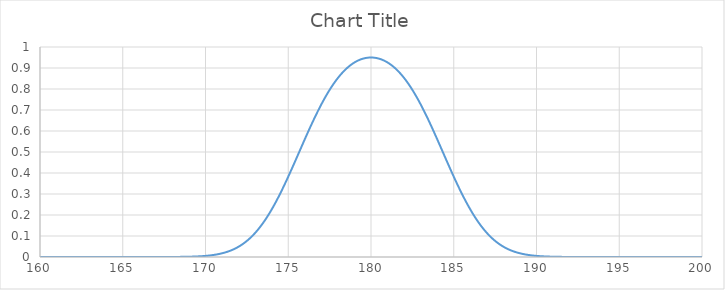
| Category | Series 0 |
|---|---|
| 160.0 | 0 |
| 160.1 | 0 |
| 160.2 | 0 |
| 160.3 | 0 |
| 160.4 | 0 |
| 160.5 | 0 |
| 160.6 | 0 |
| 160.7 | 0 |
| 160.8 | 0 |
| 160.9 | 0 |
| 161.0 | 0 |
| 161.1 | 0 |
| 161.2 | 0 |
| 161.3 | 0 |
| 161.4 | 0 |
| 161.5 | 0 |
| 161.6 | 0 |
| 161.7 | 0 |
| 161.8 | 0 |
| 161.9 | 0 |
| 162.0 | 0 |
| 162.1 | 0 |
| 162.2 | 0 |
| 162.3 | 0 |
| 162.4 | 0 |
| 162.5 | 0 |
| 162.6 | 0 |
| 162.7 | 0 |
| 162.8 | 0 |
| 162.9 | 0 |
| 163.0 | 0 |
| 163.1 | 0 |
| 163.2 | 0 |
| 163.3 | 0 |
| 163.4 | 0 |
| 163.5 | 0 |
| 163.6 | 0 |
| 163.7 | 0 |
| 163.8 | 0 |
| 163.9 | 0 |
| 164.0 | 0 |
| 164.1 | 0 |
| 164.2 | 0 |
| 164.3 | 0 |
| 164.4 | 0 |
| 164.5 | 0 |
| 164.6 | 0 |
| 164.7 | 0 |
| 164.8 | 0 |
| 164.9 | 0 |
| 165.0 | 0 |
| 165.1 | 0 |
| 165.2 | 0 |
| 165.3 | 0 |
| 165.4 | 0 |
| 165.5 | 0 |
| 165.6 | 0 |
| 165.7 | 0 |
| 165.8 | 0 |
| 165.9 | 0 |
| 166.0 | 0 |
| 166.1 | 0 |
| 166.2 | 0 |
| 166.3 | 0 |
| 166.4 | 0 |
| 166.5 | 0 |
| 166.6 | 0 |
| 166.7 | 0 |
| 166.8 | 0 |
| 166.9 | 0 |
| 167.0 | 0 |
| 167.1 | 0 |
| 167.2 | 0 |
| 167.3 | 0 |
| 167.4 | 0 |
| 167.5 | 0 |
| 167.6 | 0 |
| 167.7 | 0 |
| 167.8 | 0 |
| 167.9 | 0 |
| 168.0 | 0 |
| 168.1 | 0 |
| 168.2 | 0 |
| 168.3 | 0 |
| 168.4 | 0.001 |
| 168.5 | 0.001 |
| 168.6 | 0.001 |
| 168.7 | 0.001 |
| 168.799999999999 | 0.001 |
| 168.899999999999 | 0.001 |
| 168.999999999999 | 0.001 |
| 169.099999999999 | 0.002 |
| 169.199999999999 | 0.002 |
| 169.299999999999 | 0.002 |
| 169.399999999999 | 0.002 |
| 169.499999999999 | 0.003 |
| 169.599999999999 | 0.003 |
| 169.699999999999 | 0.004 |
| 169.799999999999 | 0.004 |
| 169.899999999999 | 0.005 |
| 169.999999999999 | 0.005 |
| 170.099999999999 | 0.006 |
| 170.199999999999 | 0.007 |
| 170.299999999999 | 0.008 |
| 170.399999999999 | 0.009 |
| 170.499999999999 | 0.01 |
| 170.599999999999 | 0.011 |
| 170.699999999999 | 0.013 |
| 170.799999999999 | 0.014 |
| 170.899999999999 | 0.016 |
| 170.999999999999 | 0.018 |
| 171.099999999999 | 0.02 |
| 171.199999999999 | 0.022 |
| 171.299999999999 | 0.024 |
| 171.399999999999 | 0.027 |
| 171.499999999999 | 0.03 |
| 171.599999999999 | 0.033 |
| 171.699999999999 | 0.037 |
| 171.799999999999 | 0.041 |
| 171.899999999999 | 0.045 |
| 171.999999999999 | 0.049 |
| 172.099999999999 | 0.054 |
| 172.199999999999 | 0.059 |
| 172.299999999999 | 0.064 |
| 172.399999999999 | 0.07 |
| 172.499999999999 | 0.077 |
| 172.599999999999 | 0.083 |
| 172.699999999999 | 0.09 |
| 172.799999999999 | 0.098 |
| 172.899999999999 | 0.106 |
| 172.999999999999 | 0.115 |
| 173.099999999999 | 0.124 |
| 173.199999999999 | 0.133 |
| 173.299999999999 | 0.143 |
| 173.399999999999 | 0.153 |
| 173.499999999999 | 0.164 |
| 173.599999999999 | 0.176 |
| 173.699999999999 | 0.188 |
| 173.799999999999 | 0.2 |
| 173.899999999999 | 0.213 |
| 173.999999999999 | 0.226 |
| 174.099999999999 | 0.24 |
| 174.199999999999 | 0.255 |
| 174.299999999999 | 0.269 |
| 174.399999999999 | 0.284 |
| 174.499999999999 | 0.3 |
| 174.599999999999 | 0.316 |
| 174.699999999999 | 0.332 |
| 174.799999999999 | 0.349 |
| 174.899999999999 | 0.365 |
| 174.999999999999 | 0.383 |
| 175.099999999999 | 0.4 |
| 175.199999999999 | 0.417 |
| 175.299999999999 | 0.435 |
| 175.399999999999 | 0.453 |
| 175.499999999999 | 0.471 |
| 175.599999999999 | 0.489 |
| 175.699999999999 | 0.507 |
| 175.799999999999 | 0.525 |
| 175.899999999999 | 0.543 |
| 175.999999999999 | 0.561 |
| 176.099999999999 | 0.578 |
| 176.199999999999 | 0.596 |
| 176.299999999999 | 0.613 |
| 176.399999999999 | 0.631 |
| 176.499999999999 | 0.647 |
| 176.599999999999 | 0.664 |
| 176.699999999999 | 0.68 |
| 176.799999999999 | 0.696 |
| 176.899999999999 | 0.712 |
| 176.999999999999 | 0.727 |
| 177.099999999999 | 0.742 |
| 177.199999999999 | 0.756 |
| 177.299999999999 | 0.77 |
| 177.399999999999 | 0.783 |
| 177.499999999999 | 0.796 |
| 177.599999999999 | 0.808 |
| 177.699999999999 | 0.82 |
| 177.799999999999 | 0.831 |
| 177.899999999999 | 0.842 |
| 177.999999999999 | 0.853 |
| 178.099999999999 | 0.862 |
| 178.199999999999 | 0.871 |
| 178.299999999999 | 0.88 |
| 178.399999999999 | 0.888 |
| 178.499999999999 | 0.896 |
| 178.599999999999 | 0.903 |
| 178.699999999999 | 0.91 |
| 178.799999999999 | 0.916 |
| 178.899999999999 | 0.921 |
| 178.999999999999 | 0.926 |
| 179.099999999999 | 0.931 |
| 179.199999999999 | 0.935 |
| 179.299999999999 | 0.938 |
| 179.399999999999 | 0.942 |
| 179.499999999999 | 0.944 |
| 179.599999999999 | 0.946 |
| 179.699999999999 | 0.948 |
| 179.799999999999 | 0.949 |
| 179.899999999999 | 0.95 |
| 179.999999999999 | 0.95 |
| 180.099999999999 | 0.95 |
| 180.199999999999 | 0.949 |
| 180.299999999999 | 0.948 |
| 180.399999999999 | 0.946 |
| 180.499999999999 | 0.944 |
| 180.599999999999 | 0.942 |
| 180.699999999999 | 0.938 |
| 180.799999999999 | 0.935 |
| 180.899999999999 | 0.931 |
| 180.999999999999 | 0.926 |
| 181.099999999999 | 0.921 |
| 181.199999999999 | 0.916 |
| 181.299999999999 | 0.91 |
| 181.399999999999 | 0.903 |
| 181.499999999999 | 0.896 |
| 181.599999999999 | 0.888 |
| 181.699999999999 | 0.88 |
| 181.799999999999 | 0.871 |
| 181.899999999999 | 0.862 |
| 181.999999999999 | 0.853 |
| 182.099999999999 | 0.842 |
| 182.199999999999 | 0.831 |
| 182.299999999999 | 0.82 |
| 182.399999999999 | 0.808 |
| 182.499999999999 | 0.796 |
| 182.599999999999 | 0.783 |
| 182.699999999999 | 0.77 |
| 182.799999999999 | 0.756 |
| 182.899999999999 | 0.742 |
| 182.999999999999 | 0.727 |
| 183.099999999999 | 0.712 |
| 183.199999999999 | 0.696 |
| 183.299999999999 | 0.68 |
| 183.399999999999 | 0.664 |
| 183.499999999999 | 0.647 |
| 183.599999999999 | 0.631 |
| 183.699999999999 | 0.613 |
| 183.799999999999 | 0.596 |
| 183.899999999999 | 0.578 |
| 183.999999999999 | 0.561 |
| 184.099999999999 | 0.543 |
| 184.199999999999 | 0.525 |
| 184.299999999999 | 0.507 |
| 184.399999999999 | 0.489 |
| 184.499999999999 | 0.471 |
| 184.599999999999 | 0.453 |
| 184.699999999999 | 0.435 |
| 184.799999999999 | 0.417 |
| 184.899999999999 | 0.4 |
| 184.999999999999 | 0.383 |
| 185.099999999999 | 0.365 |
| 185.199999999999 | 0.349 |
| 185.299999999999 | 0.332 |
| 185.399999999999 | 0.316 |
| 185.499999999999 | 0.3 |
| 185.599999999998 | 0.284 |
| 185.699999999999 | 0.269 |
| 185.799999999999 | 0.255 |
| 185.899999999998 | 0.24 |
| 185.999999999998 | 0.226 |
| 186.099999999998 | 0.213 |
| 186.199999999999 | 0.2 |
| 186.299999999999 | 0.188 |
| 186.399999999998 | 0.176 |
| 186.499999999998 | 0.164 |
| 186.599999999998 | 0.153 |
| 186.699999999999 | 0.143 |
| 186.799999999999 | 0.133 |
| 186.899999999998 | 0.124 |
| 186.999999999998 | 0.115 |
| 187.099999999998 | 0.106 |
| 187.199999999999 | 0.098 |
| 187.299999999998 | 0.09 |
| 187.399999999998 | 0.083 |
| 187.499999999998 | 0.077 |
| 187.599999999998 | 0.07 |
| 187.699999999998 | 0.064 |
| 187.799999999998 | 0.059 |
| 187.899999999998 | 0.054 |
| 187.999999999998 | 0.049 |
| 188.099999999998 | 0.045 |
| 188.199999999998 | 0.041 |
| 188.299999999998 | 0.037 |
| 188.399999999998 | 0.033 |
| 188.499999999998 | 0.03 |
| 188.599999999998 | 0.027 |
| 188.699999999998 | 0.024 |
| 188.799999999998 | 0.022 |
| 188.899999999998 | 0.02 |
| 188.999999999998 | 0.018 |
| 189.099999999998 | 0.016 |
| 189.199999999998 | 0.014 |
| 189.299999999998 | 0.013 |
| 189.399999999998 | 0.011 |
| 189.499999999998 | 0.01 |
| 189.599999999998 | 0.009 |
| 189.699999999998 | 0.008 |
| 189.799999999998 | 0.007 |
| 189.899999999998 | 0.006 |
| 189.999999999998 | 0.005 |
| 190.099999999998 | 0.005 |
| 190.199999999998 | 0.004 |
| 190.299999999998 | 0.004 |
| 190.399999999998 | 0.003 |
| 190.499999999998 | 0.003 |
| 190.599999999998 | 0.002 |
| 190.699999999998 | 0.002 |
| 190.799999999998 | 0.002 |
| 190.899999999998 | 0.002 |
| 190.999999999998 | 0.001 |
| 191.099999999998 | 0.001 |
| 191.199999999998 | 0.001 |
| 191.299999999998 | 0.001 |
| 191.399999999998 | 0.001 |
| 191.499999999998 | 0.001 |
| 191.599999999998 | 0.001 |
| 191.699999999998 | 0 |
| 191.799999999998 | 0 |
| 191.899999999998 | 0 |
| 191.999999999998 | 0 |
| 192.099999999998 | 0 |
| 192.199999999998 | 0 |
| 192.299999999998 | 0 |
| 192.399999999998 | 0 |
| 192.499999999998 | 0 |
| 192.599999999998 | 0 |
| 192.699999999998 | 0 |
| 192.799999999998 | 0 |
| 192.899999999998 | 0 |
| 192.999999999998 | 0 |
| 193.099999999998 | 0 |
| 193.199999999998 | 0 |
| 193.299999999998 | 0 |
| 193.399999999998 | 0 |
| 193.499999999998 | 0 |
| 193.599999999998 | 0 |
| 193.699999999998 | 0 |
| 193.799999999998 | 0 |
| 193.899999999998 | 0 |
| 193.999999999998 | 0 |
| 194.099999999998 | 0 |
| 194.199999999998 | 0 |
| 194.299999999998 | 0 |
| 194.399999999998 | 0 |
| 194.499999999998 | 0 |
| 194.599999999998 | 0 |
| 194.699999999998 | 0 |
| 194.799999999998 | 0 |
| 194.899999999998 | 0 |
| 194.999999999998 | 0 |
| 195.099999999998 | 0 |
| 195.199999999998 | 0 |
| 195.299999999998 | 0 |
| 195.399999999998 | 0 |
| 195.499999999998 | 0 |
| 195.599999999998 | 0 |
| 195.699999999998 | 0 |
| 195.799999999998 | 0 |
| 195.899999999998 | 0 |
| 195.999999999998 | 0 |
| 196.099999999998 | 0 |
| 196.199999999998 | 0 |
| 196.299999999998 | 0 |
| 196.399999999998 | 0 |
| 196.499999999998 | 0 |
| 196.599999999998 | 0 |
| 196.699999999998 | 0 |
| 196.799999999998 | 0 |
| 196.899999999998 | 0 |
| 196.999999999998 | 0 |
| 197.099999999998 | 0 |
| 197.199999999998 | 0 |
| 197.299999999998 | 0 |
| 197.399999999998 | 0 |
| 197.499999999998 | 0 |
| 197.599999999998 | 0 |
| 197.699999999998 | 0 |
| 197.799999999998 | 0 |
| 197.899999999998 | 0 |
| 197.999999999998 | 0 |
| 198.099999999998 | 0 |
| 198.199999999998 | 0 |
| 198.299999999998 | 0 |
| 198.399999999998 | 0 |
| 198.499999999998 | 0 |
| 198.599999999998 | 0 |
| 198.699999999998 | 0 |
| 198.799999999998 | 0 |
| 198.899999999998 | 0 |
| 198.999999999998 | 0 |
| 199.099999999998 | 0 |
| 199.199999999998 | 0 |
| 199.299999999998 | 0 |
| 199.399999999998 | 0 |
| 199.499999999998 | 0 |
| 199.599999999998 | 0 |
| 199.699999999998 | 0 |
| 199.799999999998 | 0 |
| 199.899999999998 | 0 |
| 199.999999999998 | 0 |